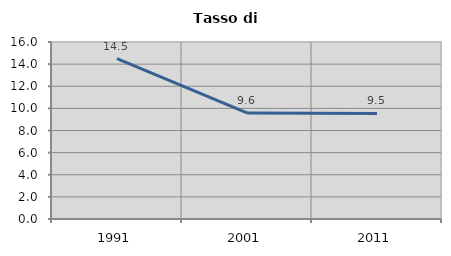
| Category | Tasso di disoccupazione   |
|---|---|
| 1991.0 | 14.506 |
| 2001.0 | 9.586 |
| 2011.0 | 9.544 |